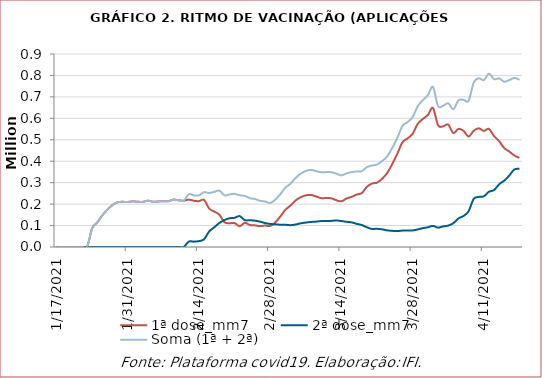
| Category | 1ª dose_mm7 | 2ª dose_mm7 | Soma (1ª + 2ª) |
|---|---|---|---|
| 1/17/21 | 0 | 0 | 0 |
| 1/18/21 | 0 | 0 | 0 |
| 1/19/21 | 0 | 0 | 0 |
| 1/20/21 | 0 | 0 | 0 |
| 1/21/21 | 0 | 0 | 0 |
| 1/22/21 | 0 | 0 | 0 |
| 1/23/21 | 0 | 0 | 0 |
| 1/24/21 | 87691.714 | 0 | 87691.714 |
| 1/25/21 | 114378.571 | 0 | 114378.571 |
| 1/26/21 | 147459.857 | 0 | 147459.857 |
| 1/27/21 | 174531.714 | 0 | 174531.714 |
| 1/28/21 | 195628.429 | 0 | 195628.429 |
| 1/29/21 | 208792 | 0 | 208792 |
| 1/30/21 | 210465 | 0 | 210465 |
| 1/31/21 | 210023.571 | 0 | 210023.571 |
| 2/1/21 | 212970.286 | 0 | 212970.286 |
| 2/2/21 | 210851.143 | 0 | 210851.143 |
| 2/3/21 | 210655.429 | 0 | 210655.429 |
| 2/4/21 | 215972.571 | 0 | 215972.571 |
| 2/5/21 | 210801.143 | 0 | 210801.143 |
| 2/6/21 | 212497.286 | 0 | 212497.286 |
| 2/7/21 | 213675.857 | 0 | 213675.857 |
| 2/8/21 | 213434.286 | 0 | 213434.286 |
| 2/9/21 | 221139 | 0 | 221139 |
| 2/10/21 | 217705.857 | 0 | 217705.857 |
| 2/11/21 | 215909.143 | 0 | 215909.143 |
| 2/12/21 | 221045.286 | 25215.143 | 246260.429 |
| 2/13/21 | 215529.857 | 24936.143 | 240466 |
| 2/14/21 | 213751.429 | 27454.429 | 241205.857 |
| 2/15/21 | 219675.143 | 36000.571 | 255675.714 |
| 2/16/21 | 179475.714 | 72411 | 251886.714 |
| 2/17/21 | 165264.286 | 91856.429 | 257120.714 |
| 2/18/21 | 150601.857 | 112115.286 | 262717.143 |
| 2/19/21 | 115660.429 | 125477 | 241137.429 |
| 2/20/21 | 110742.143 | 134094.857 | 244837 |
| 2/21/21 | 111567.143 | 136201 | 247768.143 |
| 2/22/21 | 96936.571 | 144081.143 | 241017.714 |
| 2/23/21 | 112867.857 | 125437.429 | 238305.286 |
| 2/24/21 | 102732.857 | 124741.429 | 227474.286 |
| 2/25/21 | 100898 | 122906.429 | 223804.429 |
| 2/26/21 | 97353.571 | 118199.857 | 215553.429 |
| 2/27/21 | 100102.857 | 111720.857 | 211823.714 |
| 2/28/21 | 97875.143 | 107417.286 | 205292.429 |
| 3/1/21 | 114774.286 | 105792.286 | 220566.571 |
| 3/2/21 | 142591 | 103929.857 | 246520.857 |
| 3/3/21 | 173685.286 | 103554.143 | 277239.429 |
| 3/4/21 | 193482.429 | 101856.571 | 295339 |
| 3/5/21 | 217300.429 | 104771 | 322071.429 |
| 3/6/21 | 231910.857 | 110534.857 | 342445.714 |
| 3/7/21 | 240780.714 | 113934.429 | 354715.143 |
| 3/8/21 | 242667.571 | 116827.714 | 359495.286 |
| 3/9/21 | 235761.143 | 118354.429 | 354115.571 |
| 3/10/21 | 227920.143 | 120855.143 | 348775.286 |
| 3/11/21 | 228195 | 120950.571 | 349145.571 |
| 3/12/21 | 226959.429 | 121780.286 | 348739.714 |
| 3/13/21 | 218280.429 | 123582.571 | 341863 |
| 3/14/21 | 212934 | 121102.429 | 334036.429 |
| 3/15/21 | 226117.286 | 117608.286 | 343725.571 |
| 3/16/21 | 233977.286 | 114974.571 | 348951.857 |
| 3/17/21 | 244597.286 | 107915.286 | 352512.571 |
| 3/18/21 | 251033.714 | 102455.286 | 353489 |
| 3/19/21 | 280263.714 | 91969 | 372232.714 |
| 3/20/21 | 295695 | 84299.143 | 379994.143 |
| 3/21/21 | 300039 | 84775.143 | 384814.143 |
| 3/22/21 | 318151.429 | 82352.714 | 400504.143 |
| 3/23/21 | 345060.571 | 77630.429 | 422691 |
| 3/24/21 | 387271.286 | 75313 | 462584.286 |
| 3/25/21 | 435312.429 | 74365.143 | 509677.571 |
| 3/26/21 | 488485.714 | 76439.571 | 564925.286 |
| 3/27/21 | 506042.286 | 76584 | 582626.286 |
| 3/28/21 | 527927.429 | 77297.571 | 605225 |
| 3/29/21 | 574347.429 | 81889.857 | 656237.286 |
| 3/30/21 | 596767.429 | 87891.714 | 684659.143 |
| 3/31/21 | 615622.714 | 91878.143 | 707500.857 |
| 4/1/21 | 648013.429 | 98480.857 | 746494.286 |
| 4/2/21 | 567419.429 | 90206.571 | 657626 |
| 4/3/21 | 562887.714 | 96169.143 | 659056.857 |
| 4/4/21 | 570908.429 | 99624.429 | 670532.857 |
| 4/5/21 | 531573.857 | 110964.571 | 642538.429 |
| 4/6/21 | 550705.143 | 132974.571 | 683679.714 |
| 4/7/21 | 541821.714 | 144577.143 | 686398.857 |
| 4/8/21 | 515369.143 | 166494.143 | 681863.286 |
| 4/9/21 | 541781.143 | 224414.571 | 766195.714 |
| 4/10/21 | 553547.143 | 233480.571 | 787027.714 |
| 4/11/21 | 541509 | 236523.571 | 778032.571 |
| 4/12/21 | 550602.714 | 257667 | 808269.714 |
| 4/13/21 | 517574 | 265454.857 | 783028.857 |
| 4/14/21 | 493985.143 | 292344.714 | 786329.857 |
| 4/15/21 | 461654.571 | 309270.714 | 770925.286 |
| 4/16/21 | 445285.571 | 333124.429 | 778410 |
| 4/17/21 | 426854.714 | 361605 | 788459.714 |
| 4/18/21 | 415626.571 | 364408.857 | 780035.429 |